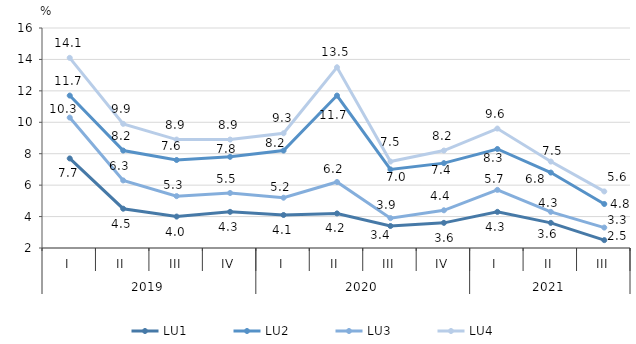
| Category | LU1 | LU2 | LU3 | LU4 |
|---|---|---|---|---|
| 0 | 7.7 | 11.7 | 10.3 | 14.1 |
| 1 | 4.5 | 8.2 | 6.3 | 9.9 |
| 2 | 4 | 7.6 | 5.3 | 8.9 |
| 3 | 4.3 | 7.8 | 5.5 | 8.9 |
| 4 | 4.1 | 8.2 | 5.2 | 9.3 |
| 5 | 4.2 | 11.7 | 6.2 | 13.5 |
| 6 | 3.4 | 7 | 3.9 | 7.5 |
| 7 | 3.6 | 7.4 | 4.4 | 8.2 |
| 8 | 4.3 | 8.3 | 5.7 | 9.6 |
| 9 | 3.6 | 6.8 | 4.3 | 7.5 |
| 10 | 2.5 | 4.8 | 3.3 | 5.6 |